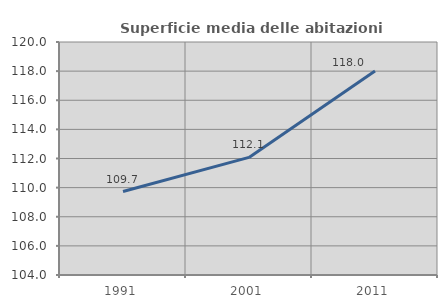
| Category | Superficie media delle abitazioni occupate |
|---|---|
| 1991.0 | 109.731 |
| 2001.0 | 112.076 |
| 2011.0 | 118.011 |